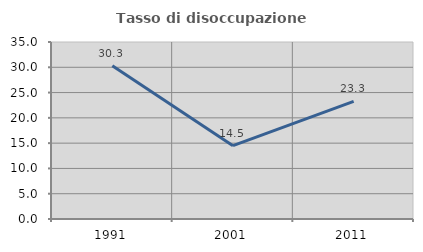
| Category | Tasso di disoccupazione giovanile  |
|---|---|
| 1991.0 | 30.29 |
| 2001.0 | 14.493 |
| 2011.0 | 23.256 |